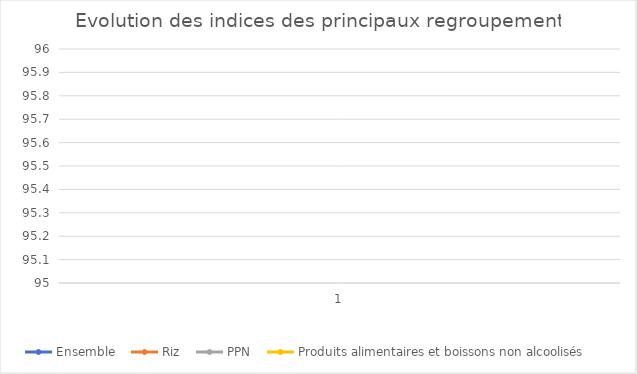
| Category |  Ensemble  |  Riz  |  PPN  |  Produits alimentaires et boissons non alcoolisés  |
|---|---|---|---|---|
| 0 | 1 | 1 | 1 | 1 |